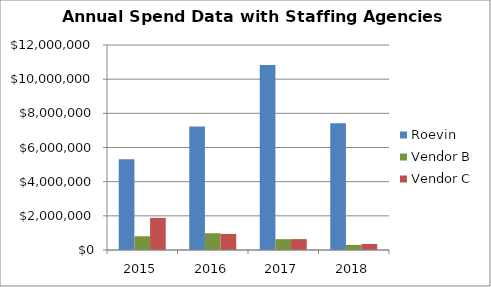
| Category | Roevin  | Vendor B | Vendor C |
|---|---|---|---|
| 2015.0 | 5306331.57 | 802076.26 | 1880722.08 |
| 2016.0 | 7222911.42 | 981248.65 | 940204.61 |
| 2017.0 | 10822998.08 | 635047.41 | 637539.8 |
| 2018.0 | 7425789.81 | 297997.51 | 352287 |